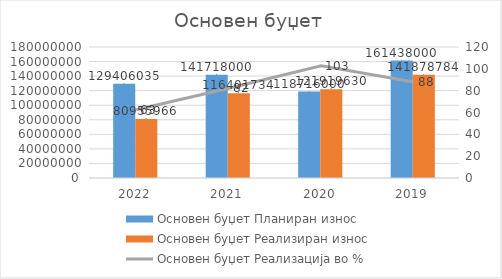
| Category | Основен буџет Планиран износ | Основен буџет Реализиран износ |
|---|---|---|
| 2022.0 | 129406035 | 80955966 |
| 2021.0 | 141718000 | 116401734 |
| 2020.0 | 118716000 | 121919630 |
| 2019.0 | 161438000 | 141878784 |